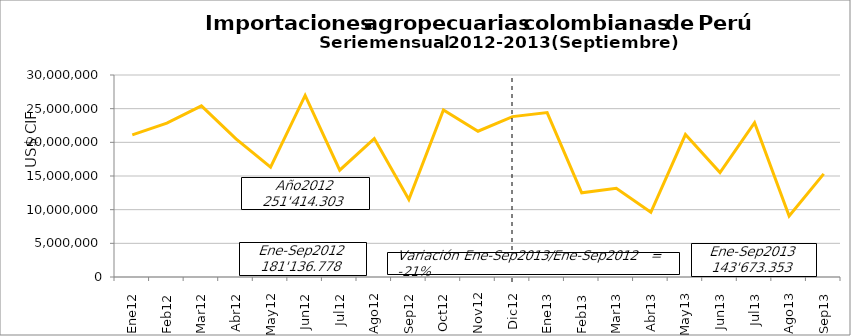
| Category | Series 0 |
|---|---|
| 0 | 21112248.95 |
| 1 | 22852031.14 |
| 2 | 25418172.78 |
| 3 | 20510087.25 |
| 4 | 16323458.65 |
| 5 | 26970002.48 |
| 6 | 15868235.51 |
| 7 | 20564059.24 |
| 8 | 11518481.84 |
| 9 | 24805656.25 |
| 10 | 21649677.9 |
| 11 | 23822191.5 |
| 12 | 24413802.54 |
| 13 | 12498223.45 |
| 14 | 13176058.57 |
| 15 | 9617151.05 |
| 16 | 21152931.59 |
| 17 | 15515420.79 |
| 18 | 22919978.1 |
| 19 | 9062478.3 |
| 20 | 15317309.02 |